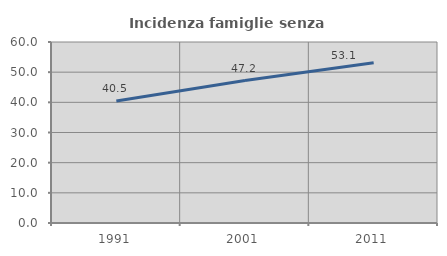
| Category | Incidenza famiglie senza nuclei |
|---|---|
| 1991.0 | 40.476 |
| 2001.0 | 47.222 |
| 2011.0 | 53.125 |